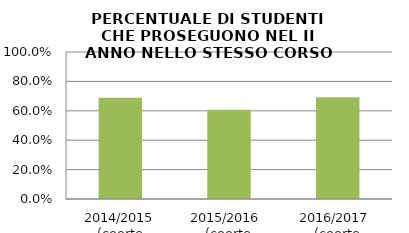
| Category | 2014/2015 (coorte 2013/14) 2015/2016  (coorte 2014/15) 2016/2017  (coorte 2015/16) |
|---|---|
| 2014/2015 (coorte 2013/14) | 0.688 |
| 2015/2016  (coorte 2014/15) | 0.607 |
| 2016/2017  (coorte 2015/16) | 0.692 |